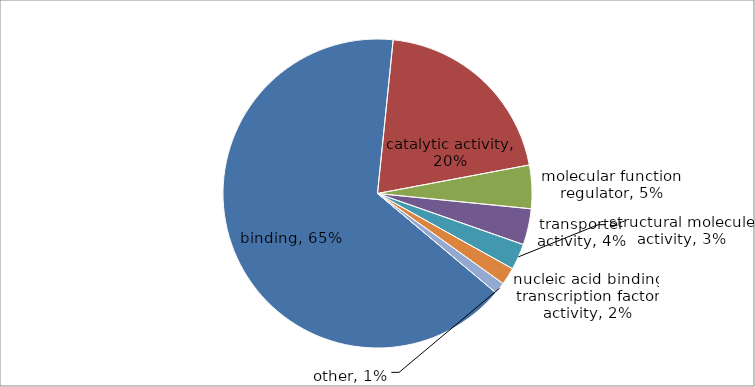
| Category | Series 0 |
|---|---|
| binding | 433 |
| catalytic activity | 135 |
| molecular function regulator | 30 |
| transporter activity | 25 |
| structural molecule activity | 18 |
| nucleic acid binding transcription factor activity | 12 |
| other | 8 |